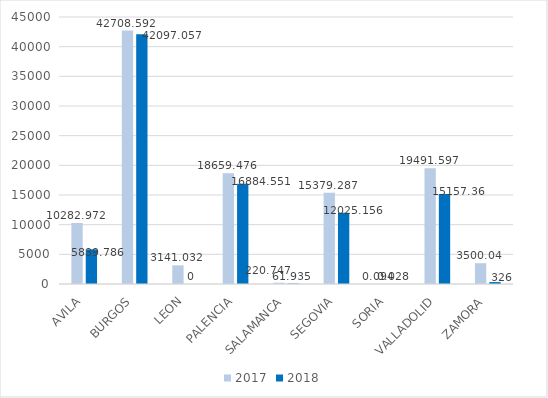
| Category | 2017 | 2018 |
|---|---|---|
| AVILA | 10282.972 | 5839.786 |
| BURGOS | 42708.592 | 42097.057 |
| LEON | 3141.032 | 0 |
| PALENCIA | 18659.476 | 16884.551 |
| SALAMANCA | 220.747 | 61.935 |
| SEGOVIA | 15379.287 | 12025.156 |
| SORIA | 0.094 | 0.028 |
| VALLADOLID | 19491.597 | 15157.36 |
| ZAMORA | 3500.04 | 326 |